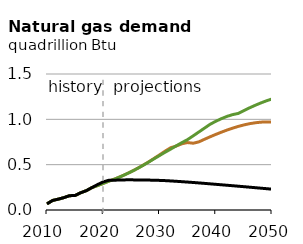
| Category | EAC | DAC | Reference |
|---|---|---|---|
| 2010.0 | 0.068 | 0.068 | 0.068 |
| 2011.0 | 0.105 | 0.105 | 0.105 |
| 2012.0 | 0.12 | 0.12 | 0.12 |
| 2013.0 | 0.136 | 0.136 | 0.136 |
| 2014.0 | 0.158 | 0.158 | 0.158 |
| 2015.0 | 0.161 | 0.161 | 0.161 |
| 2016.0 | 0.19 | 0.19 | 0.19 |
| 2017.0 | 0.214 | 0.214 | 0.214 |
| 2018.0 | 0.247 | 0.247 | 0.247 |
| 2019.0 | 0.269 | 0.269 | 0.281 |
| 2020.0 | 0.294 | 0.294 | 0.31 |
| 2021.0 | 0.319 | 0.318 | 0.328 |
| 2022.0 | 0.341 | 0.34 | 0.329 |
| 2023.0 | 0.366 | 0.366 | 0.331 |
| 2024.0 | 0.394 | 0.393 | 0.332 |
| 2025.0 | 0.424 | 0.423 | 0.332 |
| 2026.0 | 0.457 | 0.455 | 0.332 |
| 2027.0 | 0.491 | 0.489 | 0.331 |
| 2028.0 | 0.528 | 0.525 | 0.33 |
| 2029.0 | 0.567 | 0.564 | 0.329 |
| 2030.0 | 0.608 | 0.6 | 0.327 |
| 2031.0 | 0.649 | 0.637 | 0.324 |
| 2032.0 | 0.687 | 0.672 | 0.32 |
| 2033.0 | 0.706 | 0.709 | 0.317 |
| 2034.0 | 0.731 | 0.744 | 0.312 |
| 2035.0 | 0.744 | 0.777 | 0.308 |
| 2036.0 | 0.736 | 0.819 | 0.304 |
| 2037.0 | 0.752 | 0.861 | 0.299 |
| 2038.0 | 0.78 | 0.903 | 0.294 |
| 2039.0 | 0.807 | 0.946 | 0.289 |
| 2040.0 | 0.834 | 0.978 | 0.283 |
| 2041.0 | 0.858 | 1.007 | 0.278 |
| 2042.0 | 0.882 | 1.032 | 0.273 |
| 2043.0 | 0.903 | 1.052 | 0.268 |
| 2044.0 | 0.922 | 1.065 | 0.262 |
| 2045.0 | 0.938 | 1.096 | 0.257 |
| 2046.0 | 0.952 | 1.126 | 0.252 |
| 2047.0 | 0.962 | 1.154 | 0.246 |
| 2048.0 | 0.969 | 1.18 | 0.241 |
| 2049.0 | 0.972 | 1.204 | 0.235 |
| 2050.0 | 0.971 | 1.225 | 0.23 |